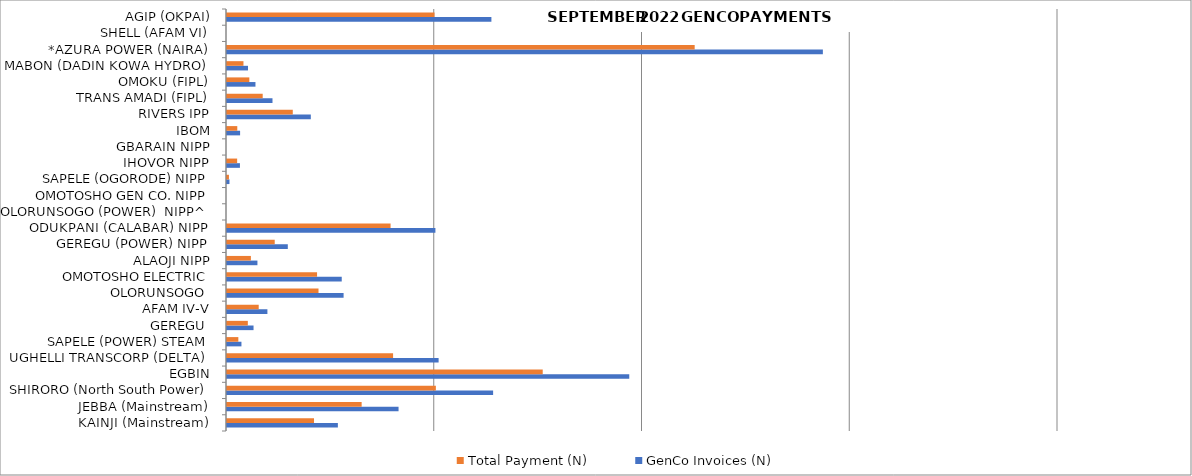
| Category | GenCo Invoices (N) | Total Payment (N) |
|---|---|---|
| KAINJI (Mainstream) | 2668380724.46 | 2094330906.815 |
| JEBBA (Mainstream) | 4128919879.85 | 3240663686.731 |
| SHIRORO (North South Power) | 6404783268.148 | 5026919669.661 |
| EGBIN | 9681465672.63 | 7598688071.605 |
| UGHELLI TRANSCORP (DELTA) | 5092994448.961 | 3997336506.339 |
| SAPELE (POWER) STEAM | 347669535.663 | 272875248.731 |
| GEREGU  | 638692635.12 | 501290431.843 |
| AFAM IV-V | 972440218.253 | 763238763.287 |
| OLORUNSOGO  | 2806082666.57 | 2202408974.778 |
| OMOTOSHO ELECTRIC | 2761474276.98 | 2167397205.968 |
| ALAOJI NIPP | 732391766.35 | 574832031.315 |
| GEREGU (POWER) NIPP | 1463516237.95 | 1148669401.509 |
| ODUKPANI (CALABAR) NIPP | 5015986955.35 | 3936895665.777 |
| OLORUNSOGO (POWER)  NIPP^ | 0 | 0 |
| OMOTOSHO GEN CO. NIPP | 0 | 0 |
| SAPELE (OGORODE) NIPP | 59450828.02 | 46661147.495 |
| IHOVOR NIPP | 311198556.97 | 244250286.342 |
| GBARAIN NIPP | 0 | 0 |
| IBOM | 315256879.8 | 247435540.55 |
| RIVERS IPP | 2017225996.707 | 1583259357.335 |
| TRANS AMADI (FIPL) | 1094849364.768 | 859313980.918 |
| OMOKU (FIPL) | 684983232.408 | 537622514.333 |
| MABON (DADIN KOWA HYDRO) | 504768952.984 | 396177805.268 |
| *AZURA POWER (NAIRA) | 14340985527.209 | 11255803547.26 |
| SHELL (AFAM VI) | 0 | 0 |
| AGIP (OKPAI) | 6363486445.636 | 4994507049.172 |